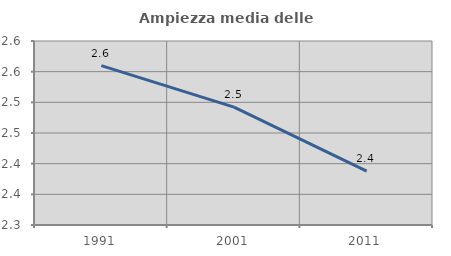
| Category | Ampiezza media delle famiglie |
|---|---|
| 1991.0 | 2.56 |
| 2001.0 | 2.492 |
| 2011.0 | 2.388 |